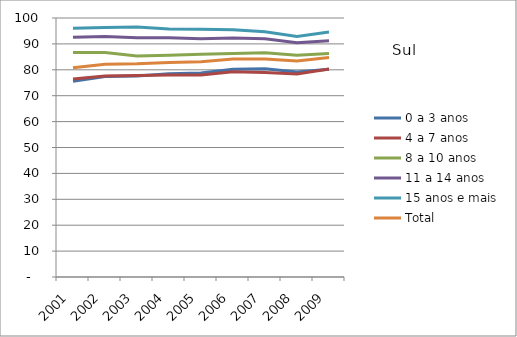
| Category | 0 a 3 anos | 4 a 7 anos | 8 a 10 anos | 11 a 14 anos | 15 anos e mais | Total |
|---|---|---|---|---|---|---|
| 2001.0 | 75.62 | 76.42 | 86.64 | 92.54 | 96 | 80.77 |
| 2002.0 | 77.44 | 77.57 | 86.69 | 92.85 | 96.34 | 82.12 |
| 2003.0 | 77.61 | 77.8 | 85.37 | 92.4 | 96.56 | 82.34 |
| 2004.0 | 78.51 | 77.96 | 85.65 | 92.33 | 95.78 | 82.86 |
| 2005.0 | 78.76 | 77.97 | 85.97 | 91.98 | 95.67 | 83.1 |
| 2006.0 | 80.21 | 79.28 | 86.3 | 92.29 | 95.47 | 84.19 |
| 2007.0 | 80.43 | 78.99 | 86.6 | 91.96 | 94.69 | 84.21 |
| 2008.0 | 79.11 | 78.42 | 85.63 | 90.47 | 92.91 | 83.38 |
| 2009.0 | 80.23 | 80.32 | 86.28 | 91.21 | 94.58 | 84.71 |